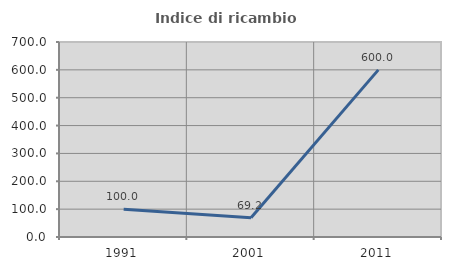
| Category | Indice di ricambio occupazionale  |
|---|---|
| 1991.0 | 100 |
| 2001.0 | 69.231 |
| 2011.0 | 600 |